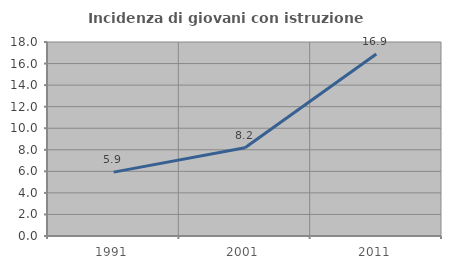
| Category | Incidenza di giovani con istruzione universitaria |
|---|---|
| 1991.0 | 5.926 |
| 2001.0 | 8.187 |
| 2011.0 | 16.883 |